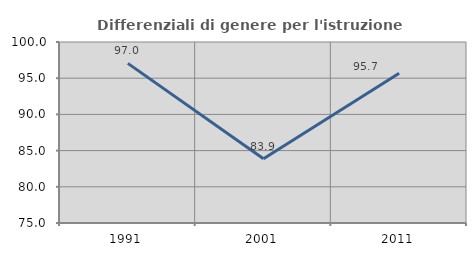
| Category | Differenziali di genere per l'istruzione superiore |
|---|---|
| 1991.0 | 97.045 |
| 2001.0 | 83.873 |
| 2011.0 | 95.697 |